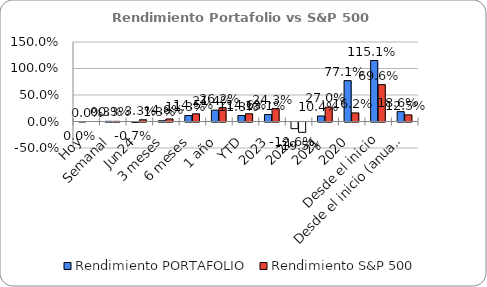
| Category | Rendimiento PORTAFOLIO | Rendimiento S&P 500 |
|---|---|---|
| Hoy | 0 | 0 |
| Semanal | 0.003 | 0.003 |
| Jun24 | -0.007 | 0.033 |
| 3 meses | 0.013 | 0.048 |
| 6 meses | 0.113 | 0.145 |
| 1 año | 0.214 | 0.262 |
| YTD | 0.113 | 0.146 |
| 2023 | 0.131 | 0.243 |
| 2022 | -0.126 | -0.195 |
| 2021 | 0.104 | 0.27 |
| 2020 | 0.771 | 0.162 |
| Desde el inicio | 1.151 | 0.696 |
| Desde el inicio (anual) | 0.186 | 0.125 |